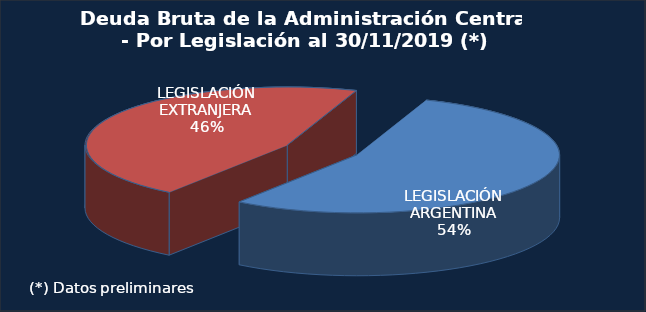
| Category | Series 0 |
|---|---|
| I- LEGISLACIÓN ARGENTINA | 169250.1 |
| II- LEGISLACIÓN EXTRANJERA | 142036.6 |